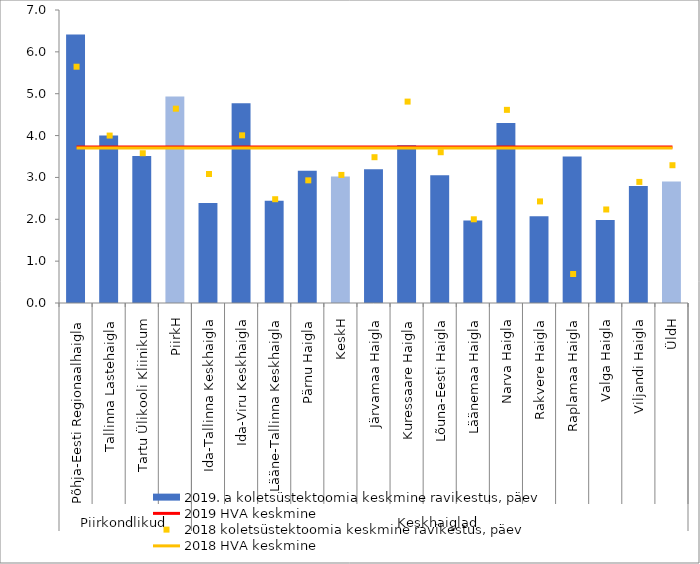
| Category | 2019. a koletsüstektoomia keskmine ravikestus, päev |
|---|---|
| 0 | 6.413 |
| 1 | 4 |
| 2 | 3.512 |
| 3 | 4.932 |
| 4 | 2.389 |
| 5 | 4.773 |
| 6 | 2.442 |
| 7 | 3.16 |
| 8 | 3.02 |
| 9 | 3.196 |
| 10 | 3.77 |
| 11 | 3.054 |
| 12 | 1.97 |
| 13 | 4.3 |
| 14 | 2.073 |
| 15 | 3.5 |
| 16 | 1.98 |
| 17 | 2.796 |
| 18 | 2.9 |